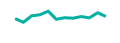
| Category | Series 0 |
|---|---|
| 0 | 0.421 |
| 1 | 0.237 |
| 2 | 0.558 |
| 3 | 0.611 |
| 4 | 0.788 |
| 5 | 0.387 |
| 6 | 0.464 |
| 7 | 0.44 |
| 8 | 0.52 |
| 9 | 0.46 |
| 10 | 0.71 |
| 11 | 0.53 |